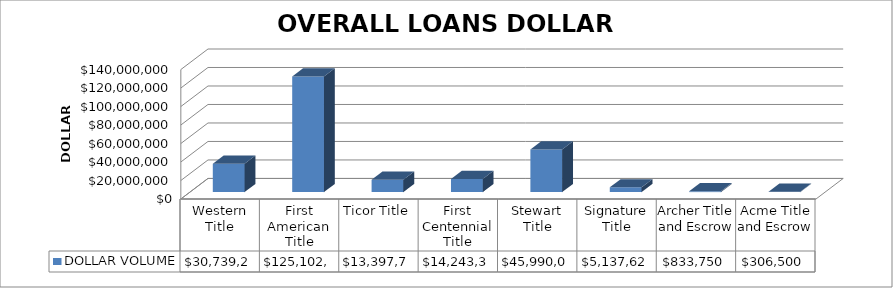
| Category | DOLLAR VOLUME |
|---|---|
| Western Title | 30739252 |
| First American Title | 125102453 |
| Ticor Title | 13397724 |
| First Centennial Title | 14243382 |
| Stewart Title | 45990046 |
| Signature Title | 5137620 |
| Archer Title and Escrow | 833750 |
| Acme Title and Escrow | 306500 |